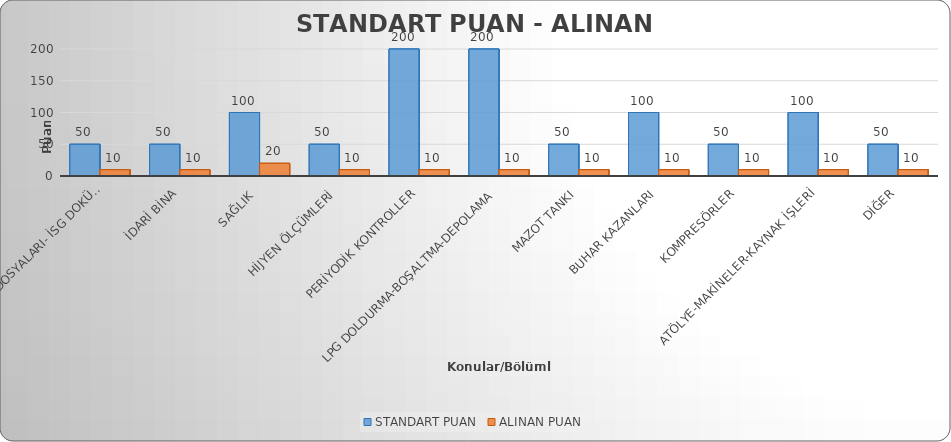
| Category | STANDART PUAN | ALINAN PUAN |
|---|---|---|
| GENEL (Özlük Dosyaları- İSG Dokümantasyon) | 50 | 10 |
| İDARİ BİNA | 50 | 10 |
| SAĞLIK  | 100 | 20 |
| HİJYEN ÖLÇÜMLERİ  | 50 | 10 |
| PERİYODİK KONTROLLER | 200 | 10 |
| LPG DOLDURMA-BOŞALTMA-DEPOLAMA | 200 | 10 |
| MAZOT TANKI | 50 | 10 |
| BUHAR KAZANLARI | 100 | 10 |
| KOMPRESÖRLER | 50 | 10 |
| ATÖLYE-MAKİNELER-KAYNAK İŞLERİ | 100 | 10 |
| DİĞER | 50 | 10 |